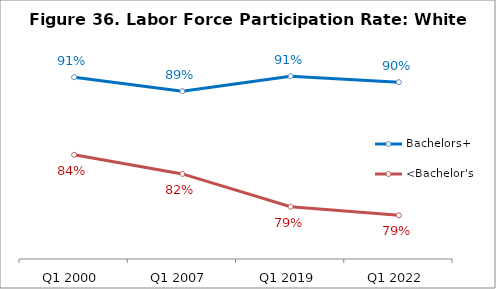
| Category | Bachelors+ | <Bachelor's |
|---|---|---|
| Q1 2000 | 0.906 | 0.839 |
| Q1 2007 | 0.894 | 0.823 |
| Q1 2019 | 0.907 | 0.795 |
| Q1 2022 | 0.902 | 0.787 |